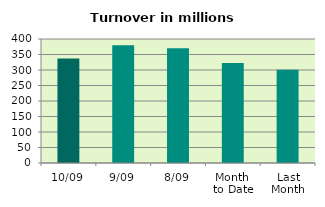
| Category | Series 0 |
|---|---|
| 10/09 | 336.901 |
| 9/09 | 379.521 |
| 8/09 | 370.266 |
| Month 
to Date | 322.674 |
| Last
Month | 300.77 |